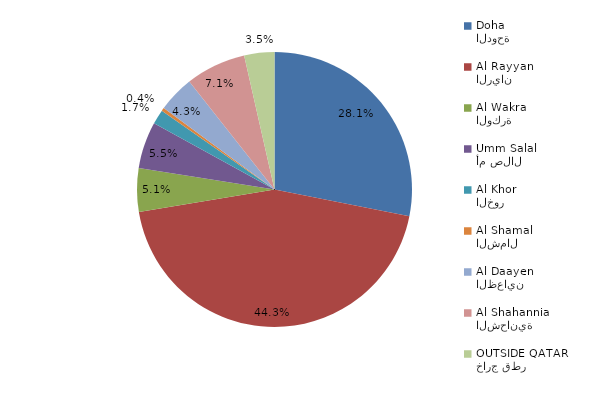
| Category | Series 0 |
|---|---|
| الدوحة
Doha | 230 |
| الريان
Al Rayyan | 362 |
| الوكرة
Al Wakra | 42 |
| أم صلال
Umm Salal | 45 |
| الخور
Al Khor | 14 |
| الشمال
Al Shamal | 3 |
| الظعاين
Al Daayen | 35 |
| الشحانية 
Al Shahannia | 58 |
| خارج قطر
OUTSIDE QATAR | 29 |